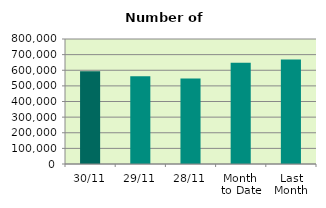
| Category | Series 0 |
|---|---|
| 30/11 | 593580 |
| 29/11 | 561204 |
| 28/11 | 546768 |
| Month 
to Date | 647745.364 |
| Last
Month | 669366.857 |